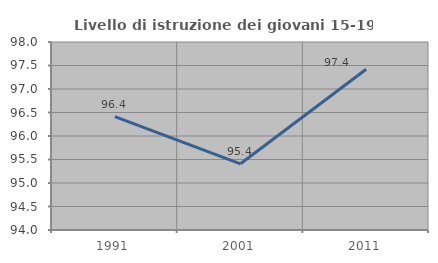
| Category | Livello di istruzione dei giovani 15-19 anni |
|---|---|
| 1991.0 | 96.413 |
| 2001.0 | 95.408 |
| 2011.0 | 97.419 |